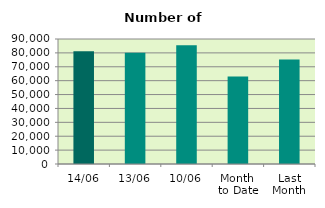
| Category | Series 0 |
|---|---|
| 14/06 | 81168 |
| 13/06 | 80132 |
| 10/06 | 85558 |
| Month 
to Date | 62977.4 |
| Last
Month | 75261.143 |